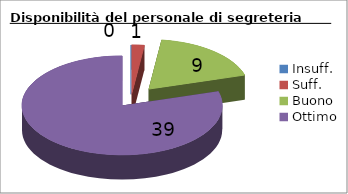
| Category | Disponibilità del personale di segreteria |
|---|---|
| Insuff. | 0 |
| Suff. | 1 |
| Buono | 9 |
| Ottimo | 39 |